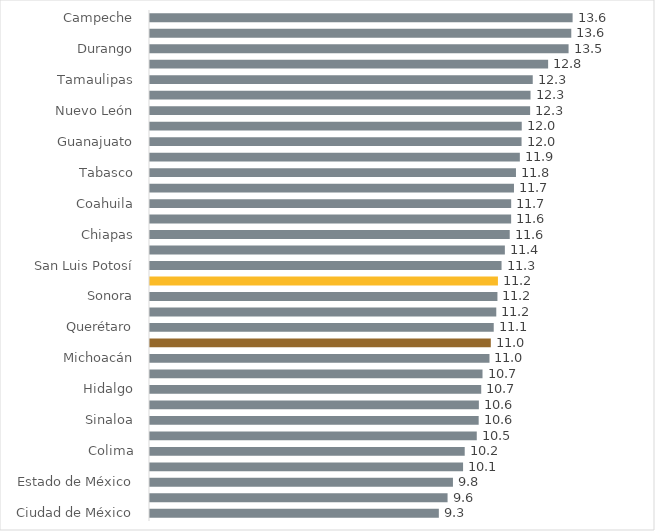
| Category | Series 0 |
|---|---|
| Ciudad de México | 9.317 |
| Baja California Sur | 9.599 |
| Estado de México | 9.772 |
| Baja California | 10.099 |
| Colima | 10.152 |
| Quintana Roo | 10.541 |
| Sinaloa | 10.602 |
| Nayarit | 10.609 |
| Hidalgo | 10.685 |
| Zacatecas | 10.726 |
| Michoacán | 10.951 |
| Nacional | 10.994 |
| Querétaro | 11.088 |
| Yucatán | 11.17 |
| Sonora | 11.208 |
| Jalisco | 11.224 |
| San Luis Potosí | 11.34 |
| Veracruz | 11.447 |
| Chiapas | 11.604 |
| Morelos | 11.65 |
| Coahuila | 11.651 |
| Aguascalientes | 11.741 |
| Tabasco | 11.806 |
| Puebla | 11.931 |
| Guanajuato | 11.986 |
| Guerrero | 11.992 |
| Nuevo León | 12.262 |
| Chihuahua | 12.275 |
| Tamaulipas | 12.347 |
| Oaxaca | 12.843 |
| Durango | 13.502 |
| Tlaxcala | 13.59 |
| Campeche | 13.633 |